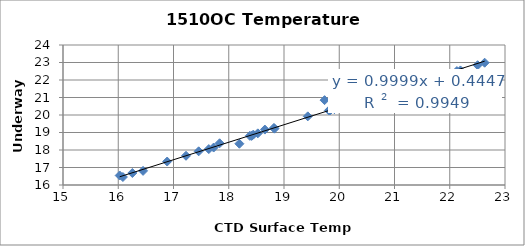
| Category | Series 0 |
|---|---|
| 21.4827 | 22.22 |
| 21.7318 | 22.145 |
| 22.6317 | 22.988 |
| 22.5047 | 22.845 |
| 22.1291 | 22.508 |
| 22.1935 | 22.547 |
| 20.5516 | 20.956 |
| 20.1373 | 20.556 |
| 20.1849 | 20.607 |
| 20.104 | 20.526 |
| 19.8299 | 20.268 |
| 19.7347 | 20.848 |
| 20.3435 | 20.74 |
| 21.9576 | 22.367 |
| 21.8497 | 22.286 |
| 20.3608 | 20.829 |
| 20.2137 | 20.615 |
| 19.8119 | 20.257 |
| 20.2025 | 20.623 |
| 20.4643 | 20.891 |
| 18.1924 | 18.358 |
| 16.0265 | 16.543 |
| 17.8347 | 18.385 |
| 16.4494 | 16.807 |
| 17.2263 | 17.67 |
| 18.8275 | 19.219 |
| 17.7268 | 18.14 |
| 16.8856 | 17.341 |
| 16.2554 | 16.686 |
| 16.0842 | 16.456 |
| 18.6536 | 19.167 |
| 17.639 | 18.052 |
| 18.4448 | 18.876 |
| 18.5259 | 18.952 |
| 18.8177 | 19.261 |
| 19.9122 | 20.336 |
| 19.8386 | 20.283 |
| 18.4135 | 18.806 |
| 18.3823 | 18.808 |
| 17.4556 | 17.924 |
| 19.4307 | 19.922 |